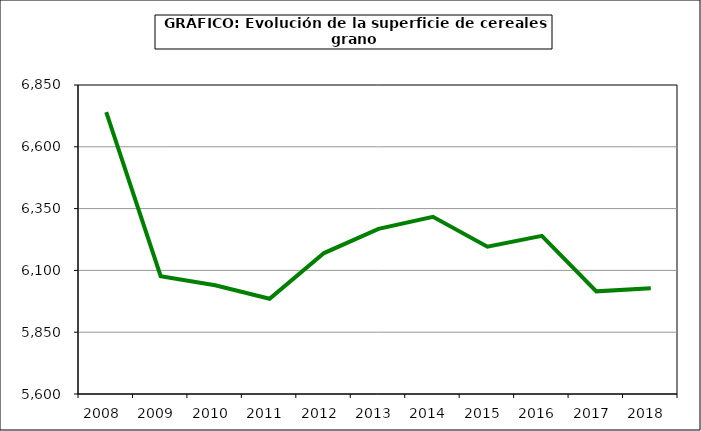
| Category | Superficie |
|---|---|
| 2008.0 | 6740.071 |
| 2009.0 | 6076.74 |
| 2010.0 | 6039.789 |
| 2011.0 | 5985.492 |
| 2012.0 | 6170.107 |
| 2013.0 | 6268.026 |
| 2014.0 | 6316.794 |
| 2015.0 | 6195.859 |
| 2016.0 | 6239.8 |
| 2017.0 | 6015.231 |
| 2018.0 | 6027.848 |